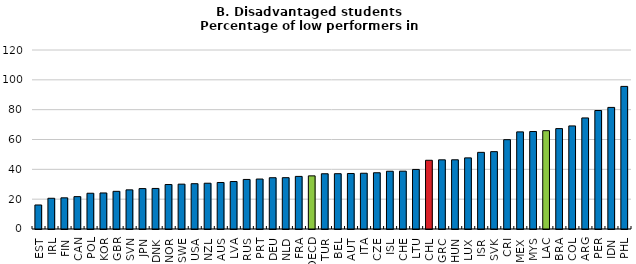
| Category | Percentage of low performers in reading (below Level 2) |
|---|---|
| EST | 16.106 |
| IRL | 20.594 |
| FIN | 20.892 |
| CAN | 21.694 |
| POL | 23.971 |
| KOR | 24.163 |
| GBR | 25.252 |
| SVN | 26.243 |
| JPN | 27.089 |
| DNK | 27.183 |
| NOR | 29.817 |
| SWE | 30.071 |
| USA | 30.367 |
| NZL | 30.687 |
| AUS | 31.174 |
| LVA | 31.829 |
| RUS | 33.225 |
| PRT | 33.495 |
| DEU | 34.375 |
| NLD | 34.402 |
| FRA | 35.261 |
| OECD | 35.625 |
| TUR | 37.036 |
| BEL | 37.071 |
| AUT | 37.216 |
| ITA | 37.384 |
| CZE | 37.704 |
| ISL | 38.716 |
| CHE | 38.774 |
| LTU | 39.923 |
| CHL | 46.077 |
| GRC | 46.376 |
| HUN | 46.4 |
| LUX | 47.68 |
| ISR | 51.382 |
| SVK | 51.859 |
| CRI | 59.894 |
| MEX | 65.11 |
| MYS | 65.342 |
| LAC | 65.914 |
| BRA | 67.309 |
| COL | 69.107 |
| ARG | 74.461 |
| PER | 79.441 |
| IDN | 81.513 |
| PHL | 95.602 |